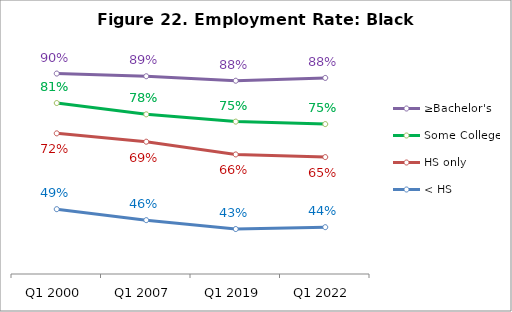
| Category | ≥Bachelor's | Some College | HS only | < HS |
|---|---|---|---|---|
| Q1 2000 | 0.897 | 0.809 | 0.719 | 0.493 |
| Q1 2007 | 0.889 | 0.776 | 0.694 | 0.46 |
| Q1 2019 | 0.876 | 0.754 | 0.656 | 0.434 |
| Q1 2022 | 0.884 | 0.747 | 0.648 | 0.44 |